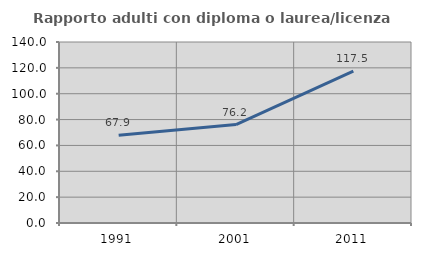
| Category | Rapporto adulti con diploma o laurea/licenza media  |
|---|---|
| 1991.0 | 67.888 |
| 2001.0 | 76.176 |
| 2011.0 | 117.521 |